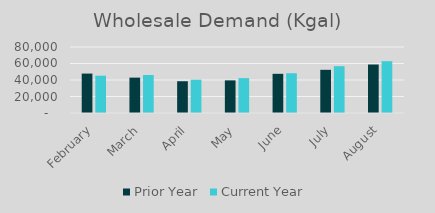
| Category | Prior Year | Current Year |
|---|---|---|
| February | 47777 | 45213 |
| March | 42881 | 46053 |
| April | 38510 | 40390 |
| May | 39535 | 42282 |
| June | 47488 | 48210 |
| July | 52336 | 56754 |
| August | 58778 | 62781 |